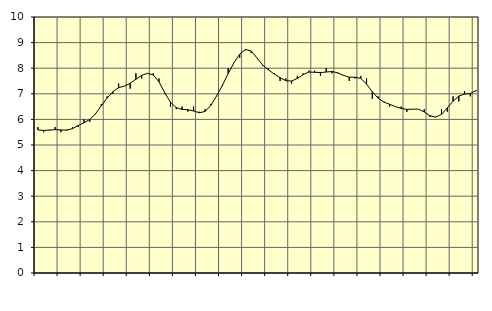
| Category | Piggar | Series 1 |
|---|---|---|
| nan | 5.7 | 5.59 |
| 1.0 | 5.5 | 5.57 |
| 1.0 | 5.6 | 5.58 |
| 1.0 | 5.7 | 5.6 |
| nan | 5.5 | 5.59 |
| 2.0 | 5.6 | 5.58 |
| 2.0 | 5.7 | 5.64 |
| 2.0 | 5.7 | 5.76 |
| nan | 6 | 5.87 |
| 3.0 | 5.9 | 6 |
| 3.0 | 6.2 | 6.22 |
| 3.0 | 6.6 | 6.53 |
| nan | 6.9 | 6.83 |
| 4.0 | 7 | 7.08 |
| 4.0 | 7.4 | 7.24 |
| 4.0 | 7.3 | 7.3 |
| nan | 7.2 | 7.41 |
| 5.0 | 7.8 | 7.57 |
| 5.0 | 7.6 | 7.72 |
| 5.0 | 7.8 | 7.8 |
| nan | 7.8 | 7.74 |
| 6.0 | 7.6 | 7.47 |
| 6.0 | 7 | 7.04 |
| 6.0 | 6.5 | 6.67 |
| nan | 6.4 | 6.46 |
| 7.0 | 6.5 | 6.39 |
| 7.0 | 6.3 | 6.38 |
| 7.0 | 6.5 | 6.33 |
| nan | 6.3 | 6.26 |
| 8.0 | 6.4 | 6.31 |
| 8.0 | 6.6 | 6.55 |
| 8.0 | 6.9 | 6.92 |
| nan | 7.3 | 7.33 |
| 9.0 | 8 | 7.79 |
| 9.0 | 8.2 | 8.21 |
| 9.0 | 8.4 | 8.55 |
| nan | 8.7 | 8.73 |
| 10.0 | 8.6 | 8.67 |
| 10.0 | 8.4 | 8.4 |
| 10.0 | 8.1 | 8.12 |
| nan | 8 | 7.93 |
| 11.0 | 7.8 | 7.77 |
| 11.0 | 7.5 | 7.63 |
| 11.0 | 7.6 | 7.51 |
| nan | 7.4 | 7.5 |
| 12.0 | 7.7 | 7.6 |
| 12.0 | 7.8 | 7.75 |
| 12.0 | 7.9 | 7.85 |
| nan | 7.9 | 7.84 |
| 13.0 | 7.7 | 7.83 |
| 13.0 | 8 | 7.85 |
| 13.0 | 7.8 | 7.87 |
| nan | 7.8 | 7.82 |
| 14.0 | 7.7 | 7.72 |
| 14.0 | 7.5 | 7.65 |
| 14.0 | 7.6 | 7.65 |
| nan | 7.7 | 7.6 |
| 15.0 | 7.6 | 7.38 |
| 15.0 | 6.8 | 7.08 |
| 15.0 | 6.9 | 6.83 |
| nan | 6.7 | 6.68 |
| 16.0 | 6.5 | 6.59 |
| 16.0 | 6.5 | 6.5 |
| 16.0 | 6.5 | 6.43 |
| nan | 6.3 | 6.39 |
| 17.0 | 6.4 | 6.4 |
| 17.0 | 6.4 | 6.4 |
| 17.0 | 6.4 | 6.29 |
| nan | 6.1 | 6.14 |
| 18.0 | 6.1 | 6.09 |
| 18.0 | 6.4 | 6.2 |
| 18.0 | 6.3 | 6.45 |
| nan | 6.9 | 6.71 |
| 19.0 | 6.7 | 6.91 |
| 19.0 | 7.1 | 6.99 |
| 19.0 | 6.9 | 7.01 |
| nan | 7.1 | 7.13 |